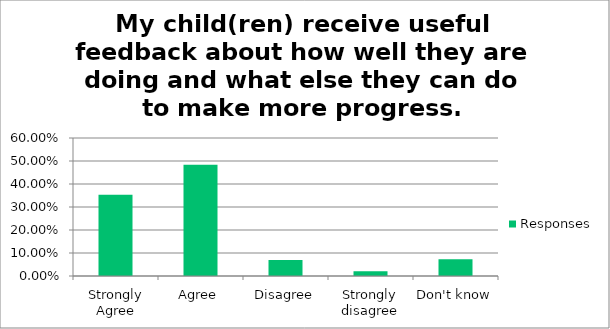
| Category | Responses |
|---|---|
| Strongly Agree | 0.354 |
| Agree | 0.484 |
| Disagree | 0.069 |
| Strongly disagree | 0.02 |
| Don't know | 0.073 |